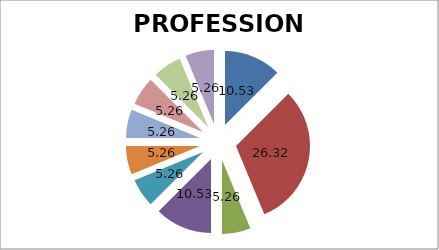
| Category | PROFESSIONE |
|---|---|
| 0 | 10.526 |
| 1 | 26.316 |
| 2 | 5.263 |
| 3 | 10.526 |
| 4 | 5.263 |
| 5 | 5.263 |
| 6 | 5.263 |
| 7 | 5.263 |
| 8 | 5.263 |
| 9 | 5.263 |